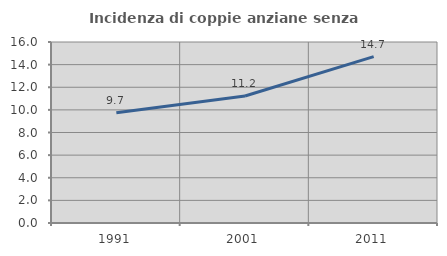
| Category | Incidenza di coppie anziane senza figli  |
|---|---|
| 1991.0 | 9.74 |
| 2001.0 | 11.232 |
| 2011.0 | 14.708 |